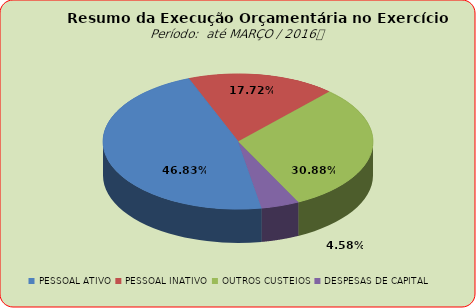
| Category | Series 0 |
|---|---|
| PESSOAL ATIVO | 34114824.54 |
| PESSOAL INATIVO | 12907990.19 |
| OUTROS CUSTEIOS | 22495641.71 |
| DESPESAS DE CAPITAL | 3336269.38 |